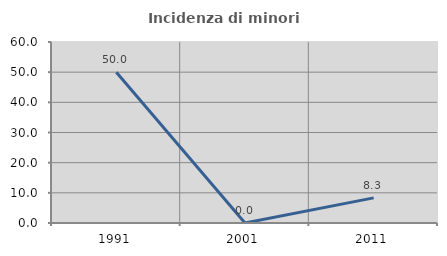
| Category | Incidenza di minori stranieri |
|---|---|
| 1991.0 | 50 |
| 2001.0 | 0 |
| 2011.0 | 8.333 |